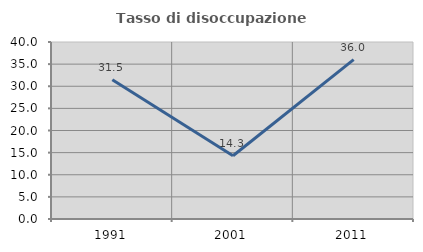
| Category | Tasso di disoccupazione giovanile  |
|---|---|
| 1991.0 | 31.481 |
| 2001.0 | 14.286 |
| 2011.0 | 36 |